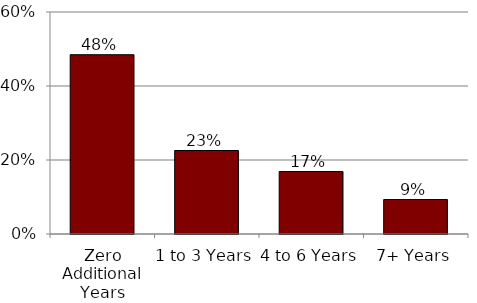
| Category | Series 0 |
|---|---|
| Zero Additional Years | 0.485 |
| 1 to 3 Years | 0.226 |
| 4 to 6 Years | 0.169 |
| 7+ Years | 0.093 |